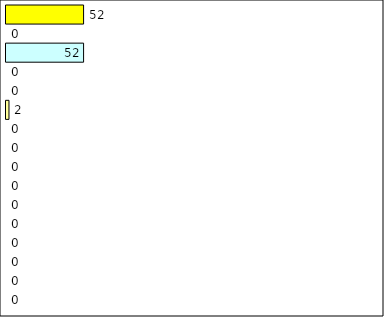
| Category | -2 | -1 | 0 | 1 | 2 | 3 | 4 | 5 | 6 | 7 | 8 | 9 | 10 | 11 | 12 | Perfect Round |
|---|---|---|---|---|---|---|---|---|---|---|---|---|---|---|---|---|
| 0 | 0 | 0 | 0 | 0 | 0 | 0 | 0 | 0 | 0 | 0 | 2 | 0 | 0 | 52 | 0 | 52 |